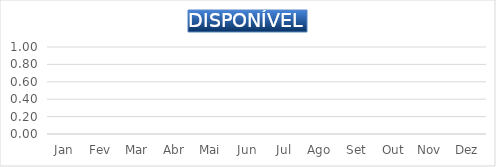
| Category | DISPONÍVEL |
|---|---|
| Jan | 0 |
| Fev | 0 |
| Mar | 0 |
| Abr | 0 |
| Mai | 0 |
| Jun | 0 |
| Jul | 0 |
| Ago | 0 |
| Set | 0 |
| Out | 0 |
| Nov | 0 |
| Dez | 0 |